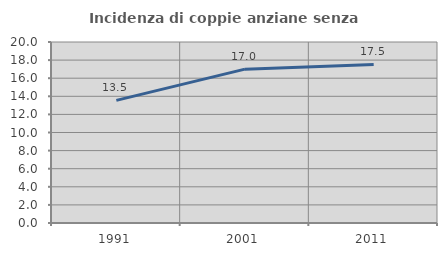
| Category | Incidenza di coppie anziane senza figli  |
|---|---|
| 1991.0 | 13.548 |
| 2001.0 | 17.002 |
| 2011.0 | 17.517 |